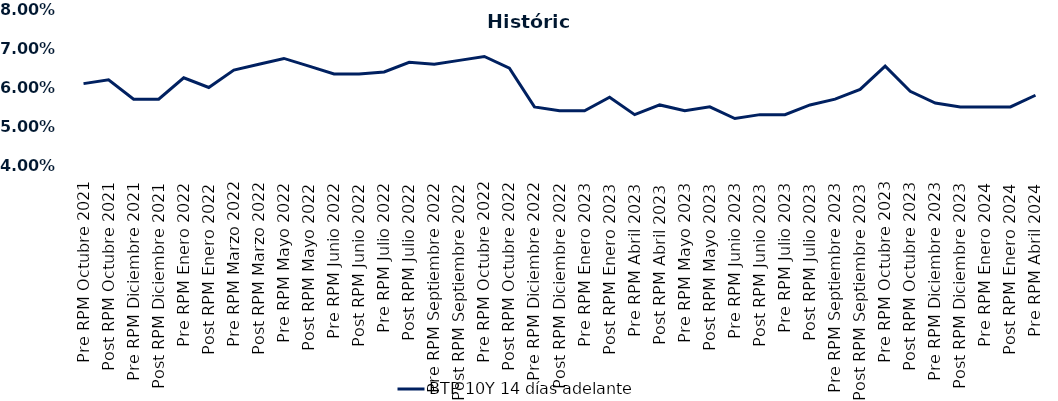
| Category | BTP 10Y 14 días adelante |
|---|---|
| Pre RPM Octubre 2021 | 0.061 |
| Post RPM Octubre 2021 | 0.062 |
| Pre RPM Diciembre 2021 | 0.057 |
| Post RPM Diciembre 2021 | 0.057 |
| Pre RPM Enero 2022 | 0.062 |
| Post RPM Enero 2022 | 0.06 |
| Pre RPM Marzo 2022 | 0.064 |
| Post RPM Marzo 2022 | 0.066 |
| Pre RPM Mayo 2022 | 0.068 |
| Post RPM Mayo 2022 | 0.066 |
| Pre RPM Junio 2022 | 0.064 |
| Post RPM Junio 2022 | 0.064 |
| Pre RPM Julio 2022 | 0.064 |
| Post RPM Julio 2022 | 0.066 |
| Pre RPM Septiembre 2022 | 0.066 |
| Post RPM Septiembre 2022 | 0.067 |
| Pre RPM Octubre 2022 | 0.068 |
| Post RPM Octubre 2022 | 0.065 |
| Pre RPM Diciembre 2022 | 0.055 |
| Post RPM Diciembre 2022 | 0.054 |
| Pre RPM Enero 2023 | 0.054 |
| Post RPM Enero 2023 | 0.058 |
| Pre RPM Abril 2023 | 0.053 |
| Post RPM Abril 2023 | 0.056 |
| Pre RPM Mayo 2023 | 0.054 |
| Post RPM Mayo 2023 | 0.055 |
| Pre RPM Junio 2023 | 0.052 |
| Post RPM Junio 2023 | 0.053 |
| Pre RPM Julio 2023 | 0.053 |
| Post RPM Julio 2023 | 0.056 |
| Pre RPM Septiembre 2023 | 0.057 |
| Post RPM Septiembre 2023 | 0.06 |
| Pre RPM Octubre 2023 | 0.066 |
| Post RPM Octubre 2023 | 0.059 |
| Pre RPM Diciembre 2023 | 0.056 |
| Post RPM Diciembre 2023 | 0.055 |
| Pre RPM Enero 2024 | 0.055 |
| Post RPM Enero 2024 | 0.055 |
| Pre RPM Abril 2024 | 0.058 |